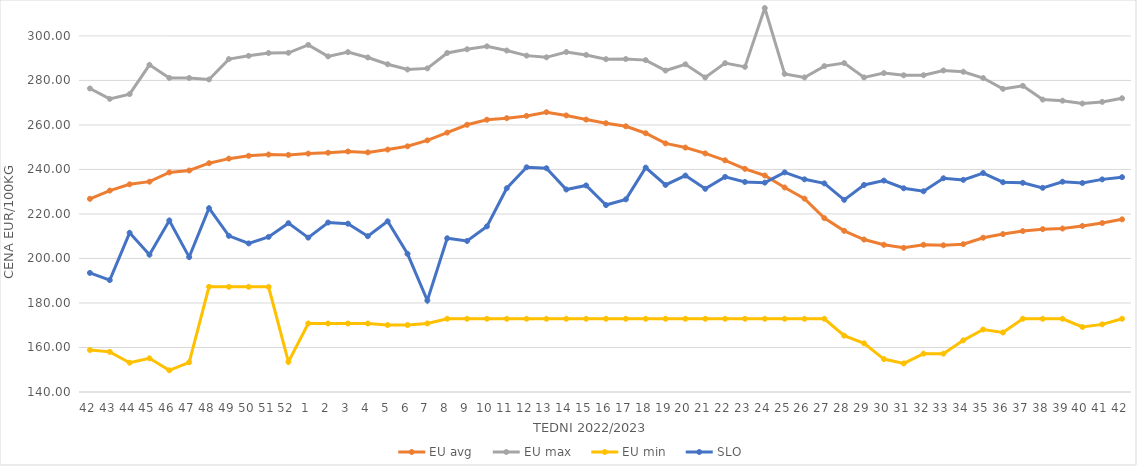
| Category | EU avg | EU max | EU min | SLO |
|---|---|---|---|---|
| 42.0 | 226.803 | 276.39 | 158.87 | 193.52 |
| 43.0 | 230.521 | 271.72 | 158.04 | 190.28 |
| 44.0 | 233.325 | 273.856 | 153.16 | 211.53 |
| 45.0 | 234.517 | 287.021 | 155.13 | 201.69 |
| 46.0 | 238.669 | 281.133 | 149.75 | 217.08 |
| 47.0 | 239.534 | 281.102 | 153.36 | 200.62 |
| 48.0 | 242.81 | 280.434 | 187.26 | 222.61 |
| 49.0 | 244.854 | 289.585 | 187.26 | 210.16 |
| 50.0 | 246.132 | 291.057 | 187.26 | 206.76 |
| 51.0 | 246.705 | 292.307 | 187.26 | 209.69 |
| 52.0 | 246.546 | 292.426 | 153.54 | 215.87 |
| 1.0 | 247.118 | 295.98 | 170.79 | 209.37 |
| 2.0 | 247.516 | 290.8 | 170.79 | 216.15 |
| 3.0 | 248.079 | 292.71 | 170.79 | 215.63 |
| 4.0 | 247.672 | 290.32 | 170.79 | 210 |
| 5.0 | 248.924 | 287.27 | 170.09 | 216.7 |
| 6.0 | 250.4 | 284.92 | 170.09 | 202.1 |
| 7.0 | 253.074 | 285.42 | 170.79 | 181.11 |
| 8.0 | 256.543 | 292.35 | 172.91 | 209.08 |
| 9.0 | 260.066 | 294.02 | 172.91 | 207.87 |
| 10.0 | 262.352 | 295.33 | 172.91 | 214.42 |
| 11.0 | 263.049 | 293.44 | 172.91 | 231.56 |
| 12.0 | 264.068 | 291.15 | 172.91 | 240.97 |
| 13.0 | 265.73 | 290.38 | 172.91 | 240.55 |
| 14.0 | 264.262 | 292.763 | 172.91 | 230.99 |
| 15.0 | 262.411 | 291.46 | 172.91 | 232.82 |
| 16.0 | 260.77 | 289.56 | 172.91 | 224 |
| 17.0 | 259.395 | 289.61 | 172.91 | 226.57 |
| 18.0 | 256.275 | 289.13 | 172.91 | 240.83 |
| 19.0 | 251.716 | 284.45 | 172.91 | 233.05 |
| 20.0 | 249.836 | 287.26 | 172.91 | 237.25 |
| 21.0 | 247.212 | 281.33 | 172.91 | 231.3 |
| 22.0 | 244.103 | 287.77 | 172.91 | 236.67 |
| 23.0 | 240.279 | 286.1 | 172.91 | 234.39 |
| 24.0 | 237.289 | 312.54 | 172.91 | 234.08 |
| 25.0 | 231.895 | 282.95 | 172.91 | 238.69 |
| 26.0 | 226.903 | 281.34 | 172.91 | 235.57 |
| 27.0 | 218.126 | 286.43 | 172.91 | 233.75 |
| 28.0 | 212.406 | 287.8 | 165.32 | 226.35 |
| 29.0 | 208.504 | 281.37 | 161.87 | 233.03 |
| 30.0 | 206.149 | 283.3 | 154.8 | 235 |
| 31.0 | 204.79 | 282.32 | 152.83 | 231.55 |
| 32.0 | 206.16 | 282.36 | 157.23 | 230.2 |
| 33.0 | 205.917 | 284.5 | 157.23 | 236.04 |
| 34.0 | 206.436 | 283.9 | 163.21 | 235.32 |
| 35.0 | 209.326 | 281.09 | 168.085 | 238.39 |
| 36.0 | 210.957 | 276.21 | 166.745 | 234.27 |
| 37.0 | 212.325 | 277.59 | 172.91 | 234 |
| 38.0 | 213.168 | 271.4 | 172.91 | 231.74 |
| 39.0 | 213.456 | 270.91 | 172.91 | 234.5 |
| 40.0 | 214.618 | 269.62 | 169.209 | 233.92 |
| 41.0 | 215.915 | 270.36 | 170.387 | 235.54 |
| 42.0 | 217.584 | 271.99 | 172.91 | 236.54 |